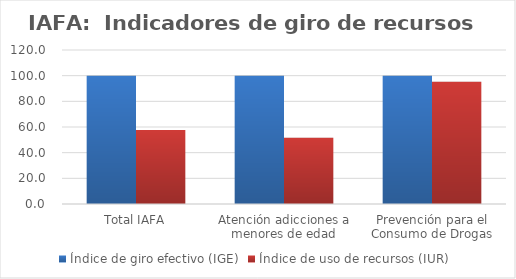
| Category | Índice de giro efectivo (IGE) | Índice de uso de recursos (IUR)  |
|---|---|---|
| Total IAFA | 99.923 | 57.639 |
| Atención adicciones a menores de edad | 99.911 | 51.678 |
| Prevención para el Consumo de Drogas | 100 | 95.332 |